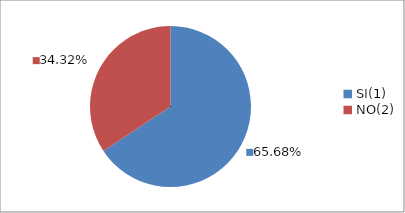
| Category | Series 0 |
|---|---|
| SI(1) | 0.657 |
| NO(2) | 0.343 |